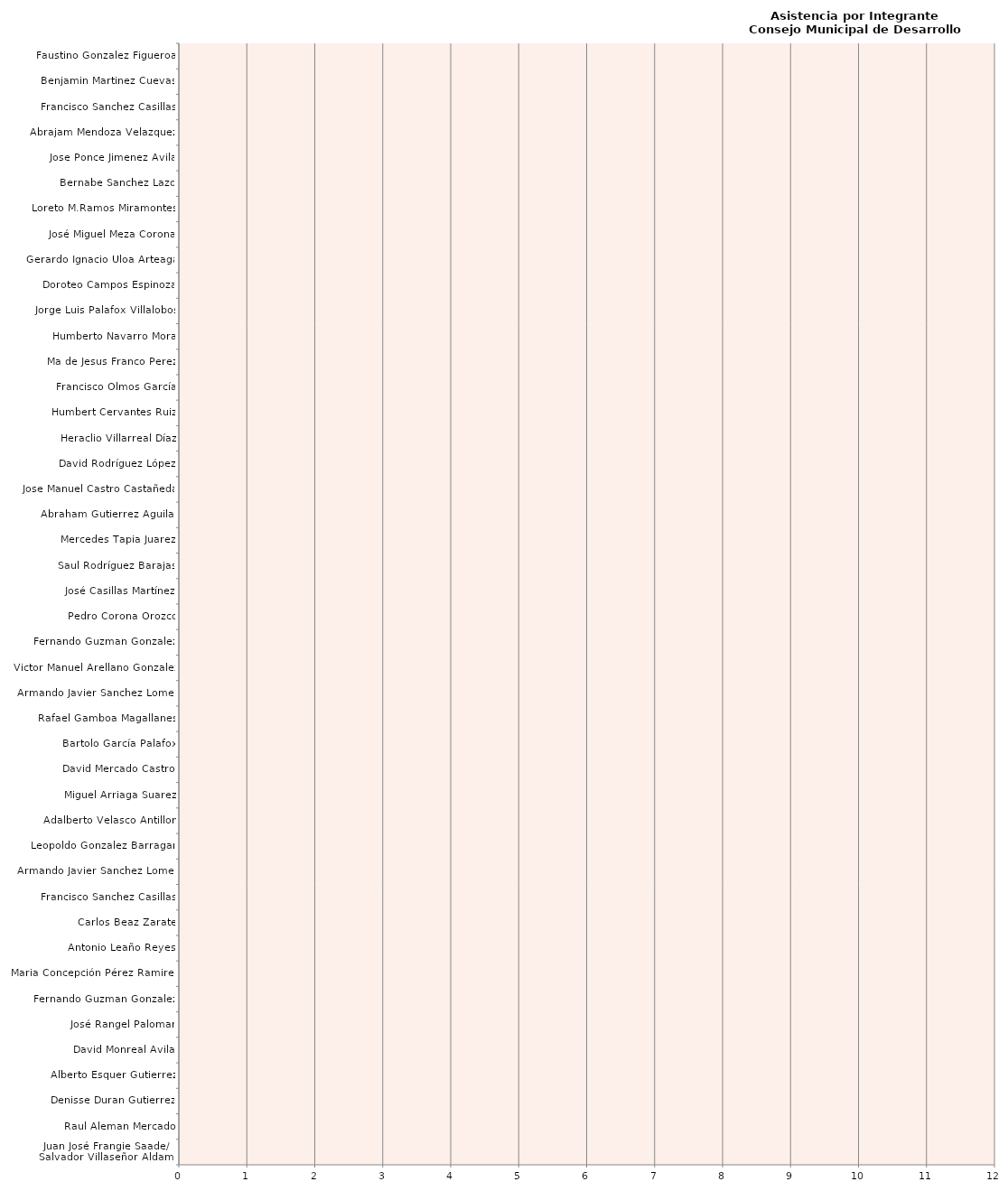
| Category | Series 0 |
|---|---|
| Juan José Frangie Saade/ 
Salvador Villaseñor Aldama | 0 |
| Raul Aleman Mercado | 0 |
| Denisse Duran Gutierrez | 0 |
| Alberto Esquer Gutierrez | 0 |
| David Monreal Avila | 0 |
| José Rangel Palomar | 0 |
| Fernando Guzman Gonzalez | 0 |
| Maria Concepción Pérez Ramirez | 0 |
| Antonio Leaño Reyes | 0 |
| Carlos Beaz Zarate | 0 |
| Francisco Sanchez Casillas | 0 |
| Armando Javier Sanchez Lomelí | 0 |
| Leopoldo Gonzalez Barragan | 0 |
| Adalberto Velasco Antillon | 0 |
| Miguel Arriaga Suarez | 0 |
| David Mercado Castro | 0 |
| Bartolo García Palafox | 0 |
| Rafael Gamboa Magallanes | 0 |
| Armando Javier Sanchez Lomelí | 0 |
| Victor Manuel Arellano Gonzalez | 0 |
| Fernando Guzman Gonzalez | 0 |
| Pedro Corona Orozco | 0 |
| José Casillas Martínez | 0 |
| Saul Rodríguez Barajas | 0 |
| Mercedes Tapia Juarez | 0 |
| Abraham Gutierrez Aguilar | 0 |
| Jose Manuel Castro Castañeda | 0 |
| David Rodríguez López | 0 |
| Heraclio Villarreal Díaz | 0 |
| Humbert Cervantes Ruiz | 0 |
| Francisco Olmos García | 0 |
| Ma de Jesus Franco Perez | 0 |
| Humberto Navarro Mora | 0 |
| Jorge Luis Palafox Villalobos | 0 |
| Doroteo Campos Espinoza | 0 |
| Gerardo Ignacio Uloa Arteaga | 0 |
| José Miguel Meza Corona | 0 |
| Loreto M.Ramos Miramontes | 0 |
| Bernabe Sanchez Lazo | 0 |
| Jose Ponce Jimenez Avila | 0 |
| Abrajam Mendoza Velazquez | 0 |
| Francisco Sanchez Casillas | 0 |
| Benjamin Martinez Cuevas | 0 |
| Faustino Gonzalez Figueroa | 0 |